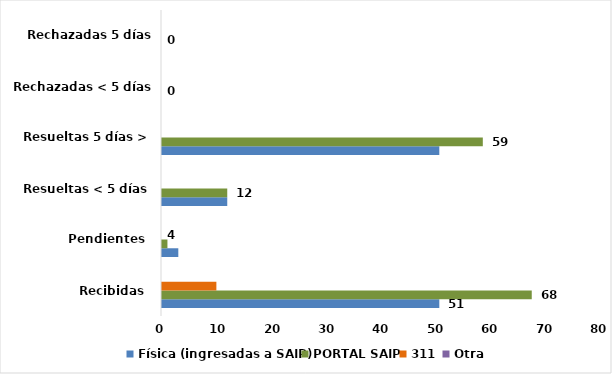
| Category | Física (ingresadas a SAIP) | PORTAL SAIP | 311 | Otra |
|---|---|---|---|---|
| Recibidas  | 51 | 68 | 10 | 0 |
| Pendientes  | 3 | 1 | 0 | 0 |
| Resueltas < 5 días | 12 | 12 | 0 | 0 |
| Resueltas 5 días > | 51 | 59 | 0 | 0 |
| Rechazadas < 5 días 2 | 0 | 0 | 0 | 0 |
| Rechazadas 5 días >3 | 0 | 0 | 0 | 0 |